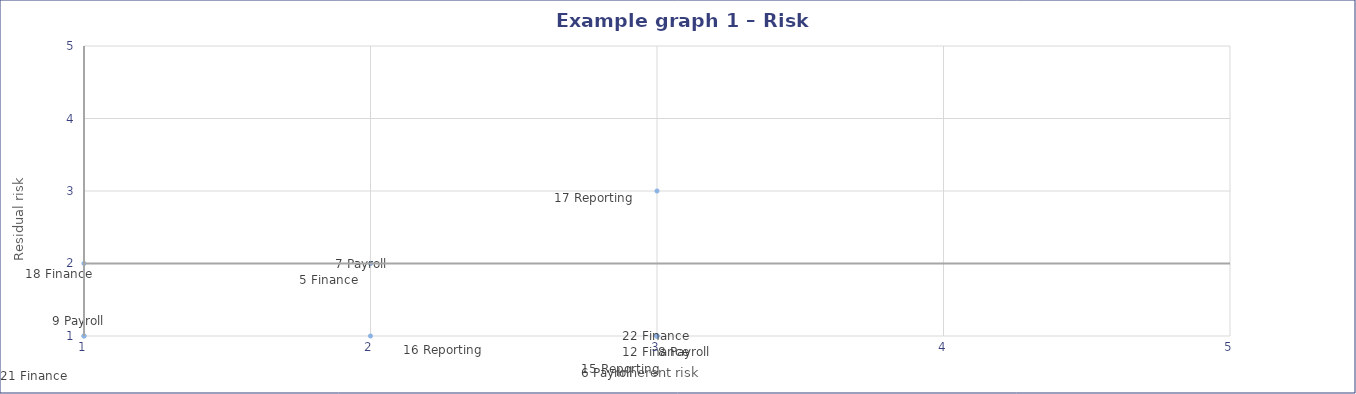
| Category | Residual Rating value |
|---|---|
| 3.0 | 1 |
| 3.0 | 1 |
| 3.0 | 1 |
| 3.0 | 1 |
| 3.0 | 1 |
| 3.0 | 3 |
| 2.0 | 1 |
| 2.0 | 2 |
| 2.0 | 2 |
| 1.0 | 1 |
| 1.0 | 1 |
| 1.0 | 2 |
| 0.0 | 0 |
| 0.0 | 0 |
| 0.0 | 0 |
| 0.0 | 0 |
| 0.0 | 0 |
| 0.0 | 0 |
| 0.0 | 0 |
| 0.0 | 0 |
| 0.0 | 0 |
| 0.0 | 0 |
| 0.0 | 0 |
| 0.0 | 0 |
| 0.0 | 0 |
| 0.0 | 0 |